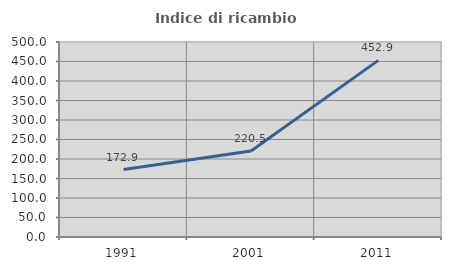
| Category | Indice di ricambio occupazionale  |
|---|---|
| 1991.0 | 172.868 |
| 2001.0 | 220.53 |
| 2011.0 | 452.941 |